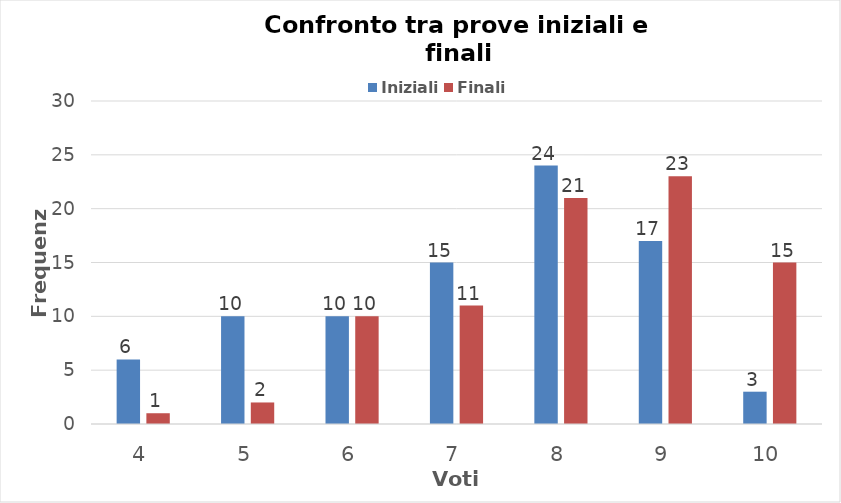
| Category | Iniziali | Finali |
|---|---|---|
| 4.0 | 6 | 1 |
| 5.0 | 10 | 2 |
| 6.0 | 10 | 10 |
| 7.0 | 15 | 11 |
| 8.0 | 24 | 21 |
| 9.0 | 17 | 23 |
| 10.0 | 3 | 15 |